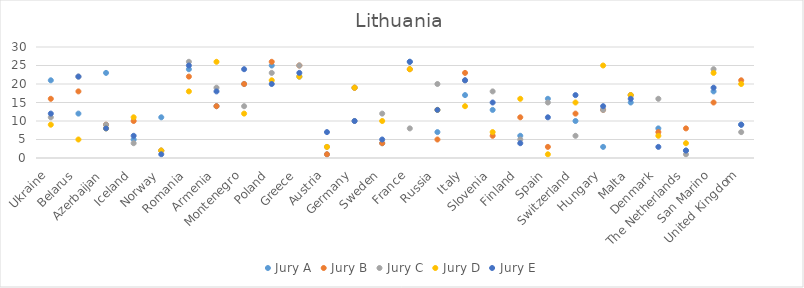
| Category | Jury A | Jury B | Jury C | Jury D | Jury E |
|---|---|---|---|---|---|
| Ukraine | 21 | 16 | 11 | 9 | 12 |
| Belarus | 12 | 18 | 22 | 5 | 22 |
| Azerbaijan | 23 | 9 | 9 | 8 | 8 |
| Iceland | 5 | 10 | 4 | 11 | 6 |
| Norway | 11 | 2 | 2 | 2 | 1 |
| Romania | 24 | 22 | 26 | 18 | 25 |
| Armenia | 14 | 14 | 19 | 26 | 18 |
| Montenegro | 20 | 20 | 14 | 12 | 24 |
| Poland | 25 | 26 | 23 | 21 | 20 |
| Greece | 22 | 25 | 25 | 22 | 23 |
| Austria | 1 | 1 | 3 | 3 | 7 |
| Germany | 19 | 19 | 10 | 19 | 10 |
| Sweden | 4 | 4 | 12 | 10 | 5 |
| France | 26 | 24 | 8 | 24 | 26 |
| Russia | 7 | 5 | 20 | 13 | 13 |
| Italy | 17 | 23 | 21 | 14 | 21 |
| Slovenia | 13 | 6 | 18 | 7 | 15 |
| Finland | 6 | 11 | 5 | 16 | 4 |
| Spain | 16 | 3 | 15 | 1 | 11 |
| Switzerland | 10 | 12 | 6 | 15 | 17 |
| Hungary | 3 | 13 | 13 | 25 | 14 |
| Malta | 15 | 17 | 17 | 17 | 16 |
| Denmark | 8 | 7 | 16 | 6 | 3 |
| The Netherlands | 2 | 8 | 1 | 4 | 2 |
| San Marino | 18 | 15 | 24 | 23 | 19 |
| United Kingdom | 9 | 21 | 7 | 20 | 9 |